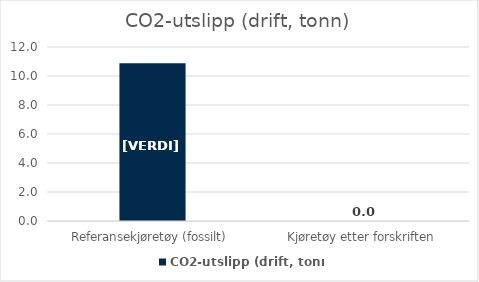
| Category | CO2-utslipp (drift, tonn) |
|---|---|
| Referansekjøretøy (fossilt) | 10.879 |
| Kjøretøy etter forskriften | 0 |